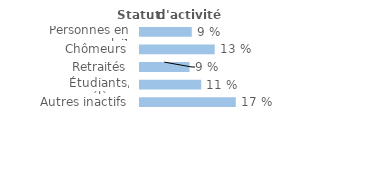
| Category | Series 0 |
|---|---|
| Personnes en emploi¹ | 0.092 |
| Chômeurs | 0.133 |
| Retraités | 0.088 |
| Étudiants, élèves | 0.109 |
| Autres inactifs  | 0.171 |